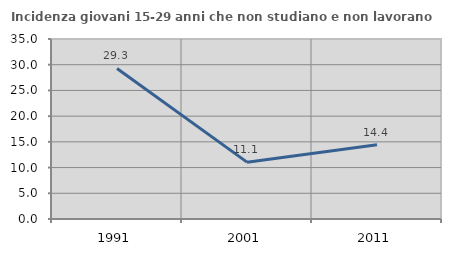
| Category | Incidenza giovani 15-29 anni che non studiano e non lavorano  |
|---|---|
| 1991.0 | 29.268 |
| 2001.0 | 11.055 |
| 2011.0 | 14.433 |